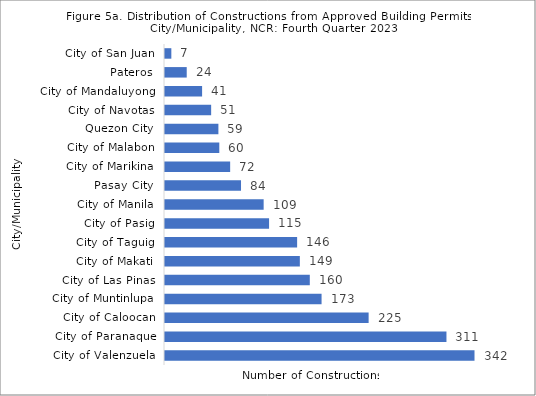
| Category | Series 0 |
|---|---|
|   City of Valenzuela  | 342 |
|   City of Paranaque  | 311 |
|   City of Caloocan  | 225 |
|   City of Muntinlupa  | 173 |
|   City of Las Pinas  | 160 |
|   City of Makati  | 149 |
|   City of Taguig  | 146 |
|   City of Pasig  | 115 |
|   City of Manila  | 109 |
|   Pasay City  | 84 |
|   City of Marikina  | 72 |
|   City of Malabon  | 60 |
|   Quezon City  | 59 |
|   City of Navotas  | 51 |
|   City of Mandaluyong  | 41 |
|   Pateros  | 24 |
|   City of San Juan  | 7 |